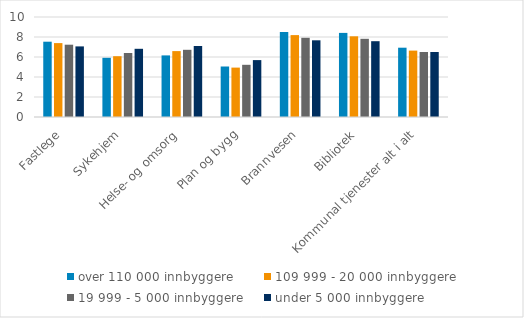
| Category | over 110 000 innbyggere | 109 999 - 20 000 innbyggere | 19 999 - 5 000 innbyggere | under 5 000 innbyggere |
|---|---|---|---|---|
| Fastlege | 7.53 | 7.39 | 7.23 | 7.06 |
| Sykehjem | 5.92 | 6.08 | 6.4 | 6.82 |
| Helse- og omsorg | 6.16 | 6.59 | 6.72 | 7.1 |
| Plan og bygg | 5.05 | 4.94 | 5.22 | 5.69 |
| Brannvesen | 8.5 | 8.19 | 7.92 | 7.67 |
| Bibliotek | 8.41 | 8.07 | 7.82 | 7.58 |
| Kommunal tjenester alt i alt | 6.93 | 6.64 | 6.5 | 6.5 |